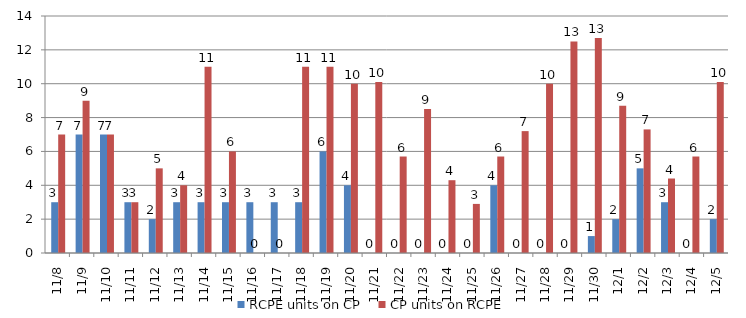
| Category | RCPE units on CP | CP units on RCPE |
|---|---|---|
| 2015-11-08 | 3 | 7 |
| 2015-11-09 | 7 | 9 |
| 2015-11-10 | 7 | 7 |
| 2015-11-11 | 3 | 3 |
| 2015-11-12 | 2 | 5 |
| 2015-11-13 | 3 | 4 |
| 2015-11-14 | 3 | 11 |
| 2015-11-15 | 3 | 6 |
| 2015-11-16 | 3 | 0 |
| 2015-11-17 | 3 | 0 |
| 2015-11-18 | 3 | 11 |
| 2015-11-19 | 6 | 11 |
| 2015-11-20 | 4 | 10 |
| 2015-11-21 | 0 | 10.1 |
| 2015-11-22 | 0 | 5.7 |
| 2015-11-23 | 0 | 8.5 |
| 2015-11-24 | 0 | 4.3 |
| 2015-11-25 | 0 | 2.9 |
| 2015-11-26 | 4 | 5.7 |
| 2015-11-27 | 0 | 7.2 |
| 2015-11-28 | 0 | 10 |
| 2015-11-29 | 0 | 12.5 |
| 2015-11-30 | 1 | 12.7 |
| 2015-12-01 | 2 | 8.7 |
| 2015-12-02 | 5 | 7.3 |
| 2015-12-03 | 3 | 4.4 |
| 2015-12-04 | 0 | 5.7 |
| 2015-12-05 | 2 | 10.1 |